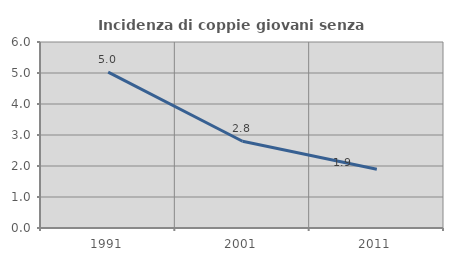
| Category | Incidenza di coppie giovani senza figli |
|---|---|
| 1991.0 | 5.027 |
| 2001.0 | 2.798 |
| 2011.0 | 1.895 |